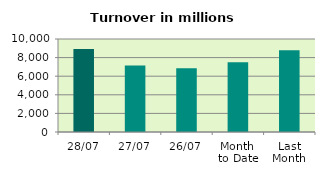
| Category | Series 0 |
|---|---|
| 28/07 | 8917.958 |
| 27/07 | 7146.029 |
| 26/07 | 6866.62 |
| Month 
to Date | 7501.064 |
| Last
Month | 8790.45 |